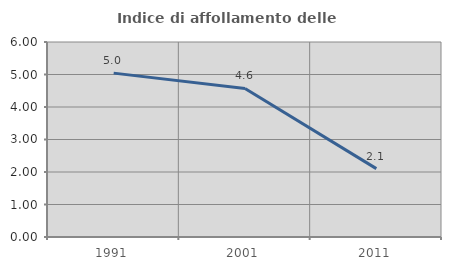
| Category | Indice di affollamento delle abitazioni  |
|---|---|
| 1991.0 | 5.042 |
| 2001.0 | 4.57 |
| 2011.0 | 2.103 |